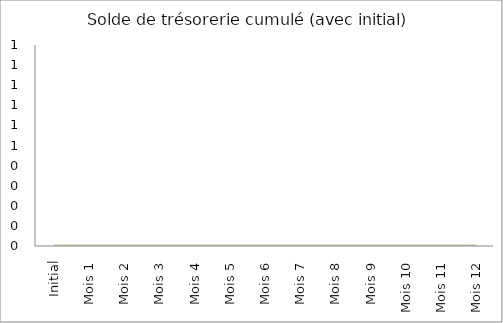
| Category | Solde de trésorerie cumulé (avec initial) |
|---|---|
| Initial | 0 |
| Mois 1 | 0 |
| Mois 2 | 0 |
| Mois 3 | 0 |
| Mois 4 | 0 |
| Mois 5 | 0 |
| Mois 6 | 0 |
| Mois 7 | 0 |
| Mois 8 | 0 |
| Mois 9 | 0 |
| Mois 10 | 0 |
| Mois 11 | 0 |
| Mois 12 | 0 |